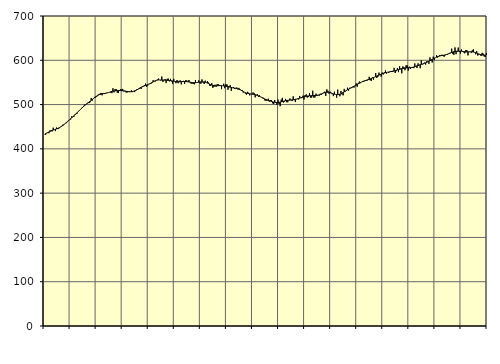
| Category | Piggar | Series 1 |
|---|---|---|
| nan | 433 | 432.89 |
| 87.0 | 431.6 | 434.21 |
| 87.0 | 436 | 435.49 |
| 87.0 | 437 | 436.75 |
| 87.0 | 435.3 | 438.06 |
| 87.0 | 441.6 | 439.34 |
| 87.0 | 442.1 | 440.55 |
| 87.0 | 439.5 | 441.63 |
| 87.0 | 447.8 | 442.59 |
| 87.0 | 443.4 | 443.46 |
| 87.0 | 440.1 | 444.3 |
| 87.0 | 448.1 | 445.15 |
| nan | 444.6 | 446.09 |
| 88.0 | 444.9 | 447.16 |
| 88.0 | 448.9 | 448.4 |
| 88.0 | 449.4 | 449.81 |
| 88.0 | 452 | 451.41 |
| 88.0 | 454.8 | 453.18 |
| 88.0 | 455 | 455.07 |
| 88.0 | 456.8 | 457.07 |
| 88.0 | 457.9 | 459.14 |
| 88.0 | 460.5 | 461.25 |
| 88.0 | 464.7 | 463.42 |
| 88.0 | 465.3 | 465.61 |
| nan | 466.2 | 467.82 |
| 89.0 | 473.4 | 470.05 |
| 89.0 | 472.7 | 472.28 |
| 89.0 | 472.2 | 474.53 |
| 89.0 | 477.8 | 476.8 |
| 89.0 | 479.7 | 479.11 |
| 89.0 | 479.6 | 481.49 |
| 89.0 | 484.4 | 483.93 |
| 89.0 | 485.6 | 486.41 |
| 89.0 | 488.7 | 488.88 |
| 89.0 | 492.5 | 491.31 |
| 89.0 | 492.5 | 493.65 |
| nan | 497.2 | 495.89 |
| 90.0 | 499.8 | 498.03 |
| 90.0 | 500.4 | 500.06 |
| 90.0 | 501 | 502.01 |
| 90.0 | 504.5 | 503.91 |
| 90.0 | 503.2 | 505.77 |
| 90.0 | 505.3 | 507.66 |
| 90.0 | 514.7 | 509.6 |
| 90.0 | 508.9 | 511.6 |
| 90.0 | 513.8 | 513.62 |
| 90.0 | 517.3 | 515.61 |
| 90.0 | 515.8 | 517.5 |
| nan | 517.3 | 519.21 |
| 91.0 | 521.8 | 520.69 |
| 91.0 | 523.3 | 521.92 |
| 91.0 | 524.5 | 522.93 |
| 91.0 | 526.3 | 523.69 |
| 91.0 | 520.9 | 524.26 |
| 91.0 | 526 | 524.68 |
| 91.0 | 523.7 | 525 |
| 91.0 | 524.4 | 525.33 |
| 91.0 | 526.5 | 525.81 |
| 91.0 | 526.1 | 526.45 |
| 91.0 | 527.1 | 527.23 |
| nan | 527.8 | 528.08 |
| 92.0 | 527.1 | 528.91 |
| 92.0 | 525.8 | 529.65 |
| 92.0 | 536.8 | 530.27 |
| 92.0 | 527.6 | 530.79 |
| 92.0 | 535.2 | 531.21 |
| 92.0 | 534.8 | 531.55 |
| 92.0 | 526.8 | 531.77 |
| 92.0 | 526 | 531.88 |
| 92.0 | 530.6 | 531.85 |
| 92.0 | 534.5 | 531.7 |
| 92.0 | 534 | 531.45 |
| nan | 535.3 | 531.15 |
| 93.0 | 529.7 | 530.82 |
| 93.0 | 531.2 | 530.46 |
| 93.0 | 527.6 | 530.06 |
| 93.0 | 527.1 | 529.61 |
| 93.0 | 528.7 | 529.21 |
| 93.0 | 530.2 | 528.92 |
| 93.0 | 528.5 | 528.86 |
| 93.0 | 532.3 | 529.08 |
| 93.0 | 528.1 | 529.55 |
| 93.0 | 530.5 | 530.2 |
| 93.0 | 528.2 | 531.03 |
| nan | 531.1 | 532.03 |
| 94.0 | 534.7 | 533.2 |
| 94.0 | 534.3 | 534.51 |
| 94.0 | 537.1 | 535.91 |
| 94.0 | 538.1 | 537.35 |
| 94.0 | 535.3 | 538.73 |
| 94.0 | 541.1 | 539.99 |
| 94.0 | 542.1 | 541.12 |
| 94.0 | 544 | 542.13 |
| 94.0 | 547.3 | 543.06 |
| 94.0 | 539.8 | 543.98 |
| 94.0 | 542.8 | 544.93 |
| nan | 546.4 | 545.99 |
| 95.0 | 546.5 | 547.16 |
| 95.0 | 547 | 548.46 |
| 95.0 | 548.7 | 549.84 |
| 95.0 | 555 | 551.24 |
| 95.0 | 552 | 552.58 |
| 95.0 | 552 | 553.77 |
| 95.0 | 555.3 | 554.68 |
| 95.0 | 556.4 | 555.27 |
| 95.0 | 558.6 | 555.56 |
| 95.0 | 555.6 | 555.61 |
| 95.0 | 554.3 | 555.56 |
| nan | 563.2 | 555.44 |
| 96.0 | 551 | 555.29 |
| 96.0 | 555.1 | 555.16 |
| 96.0 | 557.8 | 555.04 |
| 96.0 | 548.5 | 554.94 |
| 96.0 | 558.2 | 554.81 |
| 96.0 | 558.5 | 554.62 |
| 96.0 | 552.3 | 554.4 |
| 96.0 | 558.1 | 554.09 |
| 96.0 | 552.4 | 553.68 |
| 96.0 | 546.6 | 553.23 |
| 96.0 | 558 | 552.77 |
| nan | 552.3 | 552.32 |
| 97.0 | 548.2 | 551.93 |
| 97.0 | 555.4 | 551.62 |
| 97.0 | 548.2 | 551.42 |
| 97.0 | 553.7 | 551.35 |
| 97.0 | 554.6 | 551.43 |
| 97.0 | 545.5 | 551.6 |
| 97.0 | 553.2 | 551.82 |
| 97.0 | 553.6 | 552 |
| 97.0 | 546.6 | 552.09 |
| 97.0 | 555.1 | 552.06 |
| 97.0 | 554.6 | 551.85 |
| nan | 550.9 | 551.48 |
| 98.0 | 555.5 | 551.02 |
| 98.0 | 551 | 550.53 |
| 98.0 | 547.2 | 550.03 |
| 98.0 | 547.6 | 549.64 |
| 98.0 | 546.6 | 549.39 |
| 98.0 | 545.8 | 549.31 |
| 98.0 | 555.5 | 549.42 |
| 98.0 | 550 | 549.66 |
| 98.0 | 550.5 | 550.02 |
| 98.0 | 554.7 | 550.46 |
| 98.0 | 547.9 | 550.85 |
| nan | 547 | 551.15 |
| 99.0 | 556.8 | 551.29 |
| 99.0 | 549.7 | 551.21 |
| 99.0 | 546.5 | 550.9 |
| 99.0 | 554 | 550.35 |
| 99.0 | 549.5 | 549.55 |
| 99.0 | 552.8 | 548.54 |
| 99.0 | 549.8 | 547.36 |
| 99.0 | 542.9 | 546.16 |
| 99.0 | 542.1 | 545.06 |
| 99.0 | 548.3 | 544.11 |
| 99.0 | 537.8 | 543.37 |
| nan | 539.8 | 542.88 |
| 0.0 | 544.8 | 542.59 |
| 0.0 | 540.1 | 542.49 |
| 0.0 | 546.1 | 542.55 |
| 0.0 | 545.7 | 542.66 |
| 0.0 | 544.4 | 542.76 |
| 0.0 | 543.4 | 542.79 |
| 0.0 | 534.9 | 542.7 |
| 0.0 | 542.6 | 542.51 |
| 0.0 | 547 | 542.23 |
| 0.0 | 536.9 | 541.85 |
| 0.0 | 545.8 | 541.39 |
| nan | 545.5 | 540.89 |
| 1.0 | 533.5 | 540.34 |
| 1.0 | 541.7 | 539.75 |
| 1.0 | 543.9 | 539.16 |
| 1.0 | 531.1 | 538.57 |
| 1.0 | 538.2 | 538.03 |
| 1.0 | 539.6 | 537.58 |
| 1.0 | 535.7 | 537.22 |
| 1.0 | 536 | 536.85 |
| 1.0 | 538.5 | 536.36 |
| 1.0 | 534.2 | 535.67 |
| 1.0 | 537.6 | 534.78 |
| nan | 534.7 | 533.65 |
| 2.0 | 532.2 | 532.33 |
| 2.0 | 533 | 530.89 |
| 2.0 | 527.2 | 529.42 |
| 2.0 | 527.8 | 528.07 |
| 2.0 | 524.8 | 526.92 |
| 2.0 | 522.3 | 525.99 |
| 2.0 | 528.8 | 525.27 |
| 2.0 | 526.7 | 524.76 |
| 2.0 | 520.8 | 524.38 |
| 2.0 | 523.9 | 524.06 |
| 2.0 | 523.6 | 523.74 |
| nan | 527.5 | 523.36 |
| 3.0 | 526 | 522.89 |
| 3.0 | 516.3 | 522.31 |
| 3.0 | 520.9 | 521.58 |
| 3.0 | 523.4 | 520.7 |
| 3.0 | 517.3 | 519.68 |
| 3.0 | 520.9 | 518.52 |
| 3.0 | 517.8 | 517.28 |
| 3.0 | 516 | 516 |
| 3.0 | 516.1 | 514.73 |
| 3.0 | 514.6 | 513.52 |
| 3.0 | 509.1 | 512.39 |
| nan | 508.7 | 511.3 |
| 4.0 | 509.3 | 510.28 |
| 4.0 | 513.2 | 509.4 |
| 4.0 | 506.4 | 508.63 |
| 4.0 | 509.8 | 507.86 |
| 4.0 | 510 | 507.07 |
| 4.0 | 502.9 | 506.31 |
| 4.0 | 501.2 | 505.59 |
| 4.0 | 510.4 | 505.01 |
| 4.0 | 504.4 | 504.64 |
| 4.0 | 499.2 | 504.53 |
| 4.0 | 511.2 | 504.68 |
| nan | 501.2 | 505.06 |
| 5.0 | 496.4 | 505.63 |
| 5.0 | 511.3 | 506.27 |
| 5.0 | 515.2 | 506.92 |
| 5.0 | 504.5 | 507.57 |
| 5.0 | 507 | 508.18 |
| 5.0 | 512.8 | 508.72 |
| 5.0 | 505.4 | 509.21 |
| 5.0 | 505.3 | 509.59 |
| 5.0 | 510 | 509.85 |
| 5.0 | 513.8 | 510.07 |
| 5.0 | 510.5 | 510.29 |
| nan | 507.9 | 510.56 |
| 6.0 | 518.6 | 510.94 |
| 6.0 | 510 | 511.36 |
| 6.0 | 505.7 | 511.81 |
| 6.0 | 512 | 512.33 |
| 6.0 | 513.4 | 512.93 |
| 6.0 | 511.4 | 513.63 |
| 6.0 | 519.4 | 514.44 |
| 6.0 | 515.3 | 515.3 |
| 6.0 | 514.4 | 516.16 |
| 6.0 | 520 | 516.98 |
| 6.0 | 511.3 | 517.69 |
| nan | 521.6 | 518.3 |
| 7.0 | 523 | 518.78 |
| 7.0 | 515.7 | 519.16 |
| 7.0 | 517 | 519.47 |
| 7.0 | 525.8 | 519.74 |
| 7.0 | 515.7 | 519.94 |
| 7.0 | 515.9 | 520.07 |
| 7.0 | 531.2 | 520.14 |
| 7.0 | 515.7 | 520.22 |
| 7.0 | 516.2 | 520.35 |
| 7.0 | 524.7 | 520.58 |
| 7.0 | 519.9 | 520.94 |
| nan | 521 | 521.48 |
| 8.0 | 520.1 | 522.17 |
| 8.0 | 524.3 | 523.02 |
| 8.0 | 522 | 524.05 |
| 8.0 | 523.9 | 525.11 |
| 8.0 | 527 | 526.11 |
| 8.0 | 529.1 | 526.98 |
| 8.0 | 519.5 | 527.59 |
| 8.0 | 534.4 | 527.85 |
| 8.0 | 531.1 | 527.82 |
| 8.0 | 524.4 | 527.45 |
| 8.0 | 529.3 | 526.78 |
| nan | 526.7 | 525.96 |
| 9.0 | 523.5 | 525.06 |
| 9.0 | 519.1 | 524.17 |
| 9.0 | 529.1 | 523.4 |
| 9.0 | 523.1 | 522.83 |
| 9.0 | 515.7 | 522.53 |
| 9.0 | 533.8 | 522.55 |
| 9.0 | 522 | 522.91 |
| 9.0 | 518.8 | 523.62 |
| 9.0 | 530.7 | 524.59 |
| 9.0 | 523 | 525.82 |
| 9.0 | 520.9 | 527.24 |
| nan | 535.4 | 528.75 |
| 10.0 | 529.1 | 530.33 |
| 10.0 | 530.8 | 531.9 |
| 10.0 | 538.1 | 533.39 |
| 10.0 | 531.5 | 534.76 |
| 10.0 | 537.8 | 536.07 |
| 10.0 | 538.1 | 537.33 |
| 10.0 | 537.2 | 538.55 |
| 10.0 | 540.7 | 539.81 |
| 10.0 | 538.3 | 541.14 |
| 10.0 | 541.7 | 542.54 |
| 10.0 | 547.8 | 544.03 |
| nan | 540.2 | 545.52 |
| 11.0 | 549 | 546.94 |
| 11.0 | 552 | 548.32 |
| 11.0 | 548.4 | 549.6 |
| 11.0 | 550.7 | 550.81 |
| 11.0 | 553.1 | 551.93 |
| 11.0 | 551.3 | 552.91 |
| 11.0 | 554.6 | 553.78 |
| 11.0 | 553.3 | 554.62 |
| 11.0 | 554.2 | 555.42 |
| 11.0 | 555.4 | 556.22 |
| 11.0 | 562.7 | 557.08 |
| nan | 554.7 | 557.98 |
| 12.0 | 553.8 | 558.97 |
| 12.0 | 561.5 | 559.98 |
| 12.0 | 556.2 | 561 |
| 12.0 | 562 | 562.04 |
| 12.0 | 571.2 | 563.12 |
| 12.0 | 560.1 | 564.24 |
| 12.0 | 562.6 | 565.4 |
| 12.0 | 572.2 | 566.55 |
| 12.0 | 567.6 | 567.67 |
| 12.0 | 563 | 568.73 |
| 12.0 | 572.3 | 569.64 |
| nan | 568.1 | 570.45 |
| 13.0 | 572.8 | 571.2 |
| 13.0 | 577.1 | 571.89 |
| 13.0 | 570 | 572.53 |
| 13.0 | 573.1 | 573.1 |
| 13.0 | 571.8 | 573.57 |
| 13.0 | 573.5 | 574.03 |
| 13.0 | 575.9 | 574.52 |
| 13.0 | 574 | 575.03 |
| 13.0 | 574.1 | 575.56 |
| 13.0 | 582.8 | 576.15 |
| 13.0 | 571.3 | 576.76 |
| nan | 575.4 | 577.39 |
| 14.0 | 582.7 | 578.06 |
| 14.0 | 573.2 | 578.75 |
| 14.0 | 586.4 | 579.47 |
| 14.0 | 581.5 | 580.23 |
| 14.0 | 570.6 | 580.97 |
| 14.0 | 586.2 | 581.62 |
| 14.0 | 584 | 582.12 |
| 14.0 | 577.6 | 582.5 |
| 14.0 | 588.6 | 582.75 |
| 14.0 | 588.5 | 582.9 |
| 14.0 | 576.7 | 583.05 |
| nan | 585.5 | 583.23 |
| 15.0 | 580.3 | 583.45 |
| 15.0 | 582.9 | 583.76 |
| 15.0 | 582.6 | 584.21 |
| 15.0 | 582.3 | 584.8 |
| 15.0 | 592.9 | 585.57 |
| 15.0 | 586.7 | 586.47 |
| 15.0 | 582.5 | 587.42 |
| 15.0 | 593.1 | 588.35 |
| 15.0 | 588.7 | 589.22 |
| 15.0 | 582 | 590.02 |
| 15.0 | 599.7 | 590.78 |
| nan | 590.8 | 591.59 |
| 16.0 | 591.3 | 592.45 |
| 16.0 | 594.6 | 593.36 |
| 16.0 | 590.4 | 594.36 |
| 16.0 | 597.8 | 595.43 |
| 16.0 | 597 | 596.58 |
| 16.0 | 592.1 | 597.76 |
| 16.0 | 606.5 | 599.03 |
| 16.0 | 601.2 | 600.37 |
| 16.0 | 595 | 601.76 |
| 16.0 | 608.3 | 603.2 |
| 16.0 | 600.5 | 604.63 |
| nan | 606 | 605.96 |
| 17.0 | 611.3 | 607.17 |
| 17.0 | 606.2 | 608.22 |
| 17.0 | 607.7 | 609.09 |
| 17.0 | 612 | 609.76 |
| 17.0 | 611.4 | 610.26 |
| 17.0 | 612.5 | 610.71 |
| 17.0 | 611.7 | 611.14 |
| 17.0 | 607.9 | 611.6 |
| 17.0 | 611.2 | 612.19 |
| 17.0 | 612.5 | 612.92 |
| 17.0 | 612.6 | 613.73 |
| nan | 614.2 | 614.69 |
| 18.0 | 616.7 | 615.7 |
| 18.0 | 616.1 | 616.71 |
| 18.0 | 626.3 | 617.69 |
| 18.0 | 614.1 | 618.6 |
| 18.0 | 612.1 | 619.34 |
| 18.0 | 629 | 619.88 |
| 18.0 | 613.8 | 620.27 |
| 18.0 | 619.3 | 620.53 |
| 18.0 | 628.7 | 620.67 |
| 18.0 | 619.4 | 620.7 |
| 18.0 | 615.2 | 620.59 |
| nan | 624.5 | 620.34 |
| 19.0 | 621 | 619.98 |
| 19.0 | 617.9 | 619.6 |
| 19.0 | 615.7 | 619.26 |
| 19.0 | 622.9 | 619.02 |
| 19.0 | 622.8 | 618.96 |
| 19.0 | 611.1 | 619.05 |
| 19.0 | 619.1 | 619.19 |
| 19.0 | 619.6 | 619.31 |
| 19.0 | 616.8 | 619.27 |
| 19.0 | 622.7 | 619.02 |
| 19.0 | 624.7 | 618.61 |
| nan | 617.7 | 618 |
| 20.0 | 613.5 | 617.18 |
| 20.0 | 620.7 | 616.23 |
| 20.0 | 610.7 | 615.22 |
| 20.0 | 613.1 | 614.21 |
| 20.0 | 612.9 | 613.27 |
| 20.0 | 609.7 | 612.5 |
| 20.0 | 616.9 | 611.98 |
| 20.0 | 614.8 | 611.7 |
| 20.0 | 608.4 | 611.63 |
| 20.0 | 607.4 | 611.75 |
| 20.0 | 616.5 | 611.99 |